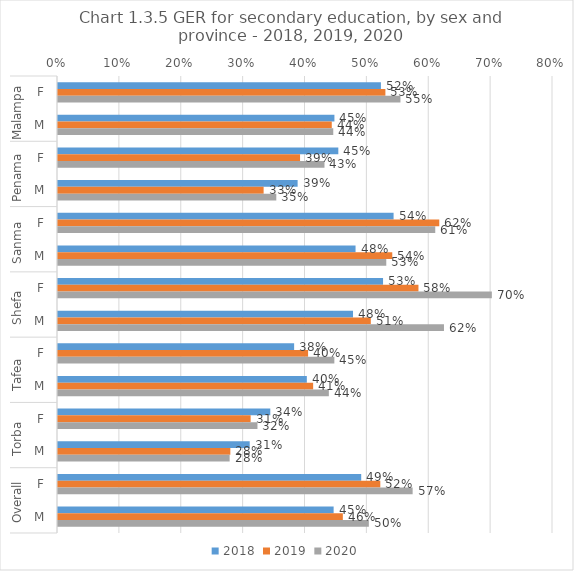
| Category | 2018 | 2019 | 2020 |
|---|---|---|---|
| 0 | 0.522 | 0.529 | 0.553 |
| 1 | 0.447 | 0.442 | 0.445 |
| 2 | 0.453 | 0.391 | 0.431 |
| 3 | 0.387 | 0.332 | 0.353 |
| 4 | 0.542 | 0.616 | 0.61 |
| 5 | 0.481 | 0.54 | 0.531 |
| 6 | 0.525 | 0.583 | 0.701 |
| 7 | 0.477 | 0.506 | 0.624 |
| 8 | 0.382 | 0.404 | 0.447 |
| 9 | 0.402 | 0.412 | 0.438 |
| 10 | 0.343 | 0.311 | 0.322 |
| 11 | 0.31 | 0.279 | 0.277 |
| 12 | 0.49 | 0.521 | 0.573 |
| 13 | 0.445 | 0.46 | 0.502 |